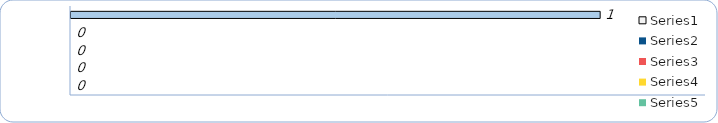
| Category | Series 0 | Series 1 | Series 2 | Series 3 | Series 4 |
|---|---|---|---|---|---|
| Status #1 | 1 |  |  |  |  |
| Status #2 | 0 |  |  |  |  |
| Status #3 | 0 |  |  |  |  |
| Status #4 | 0 |  |  |  |  |
| Status #5 | 0 |  |  |  |  |